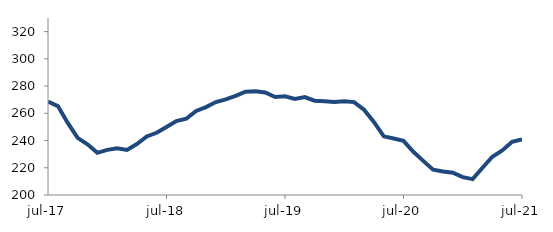
| Category | Series 0 |
|---|---|
| 2017-07-01 | 268.618 |
| 2017-08-01 | 265.289 |
| 2017-09-01 | 252.912 |
| 2017-10-01 | 242.002 |
| 2017-11-01 | 237.205 |
| 2017-12-01 | 230.992 |
| 2018-01-01 | 233.165 |
| 2018-02-01 | 234.384 |
| 2018-03-01 | 233.06 |
| 2018-04-01 | 237.465 |
| 2018-05-01 | 242.979 |
| 2018-06-01 | 245.679 |
| 2018-07-01 | 249.89 |
| 2018-08-01 | 254.238 |
| 2018-09-01 | 255.99 |
| 2018-10-01 | 261.71 |
| 2018-11-01 | 264.538 |
| 2018-12-01 | 268.288 |
| 2019-01-01 | 270.264 |
| 2019-02-01 | 272.765 |
| 2019-03-01 | 275.922 |
| 2019-04-01 | 276.17 |
| 2019-05-01 | 275.323 |
| 2019-06-01 | 271.933 |
| 2019-07-01 | 272.528 |
| 2019-08-01 | 270.617 |
| 2019-09-01 | 271.909 |
| 2019-10-01 | 269.246 |
| 2019-11-01 | 268.873 |
| 2019-12-01 | 268.319 |
| 2020-01-01 | 268.914 |
| 2020-02-01 | 268.233 |
| 2020-03-01 | 262.58 |
| 2020-04-01 | 253.663 |
| 2020-05-01 | 243.088 |
| 2020-06-01 | 241.541 |
| 2020-07-01 | 239.786 |
| 2020-08-01 | 231.766 |
| 2020-09-01 | 225.047 |
| 2020-10-01 | 218.571 |
| 2020-11-01 | 217.286 |
| 2020-12-01 | 216.368 |
| 2021-01-01 | 213.087 |
| 2021-02-01 | 211.643 |
| 2021-03-01 | 220.04 |
| 2021-04-01 | 228.12 |
| 2021-05-01 | 232.717 |
| 2021-06-01 | 239.097 |
| 2021-07-01 | 240.846 |